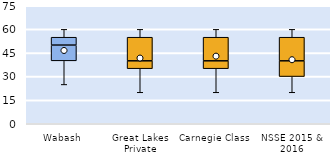
| Category | 25th | 50th | 75th |
|---|---|---|---|
| Wabash | 40 | 10 | 5 |
| Great Lakes Private | 35 | 5 | 15 |
| Carnegie Class | 35 | 5 | 15 |
| NSSE 2015 & 2016 | 30 | 10 | 15 |